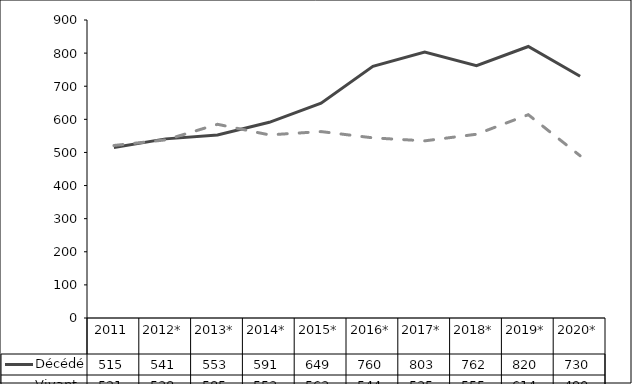
| Category | Décédé | Vivant |
|---|---|---|
| 2011 | 515 | 521 |
| 2012* | 541 | 538 |
| 2013* | 553 | 585 |
| 2014* | 591 | 553 |
| 2015* | 649 | 563 |
| 2016* | 760 | 544 |
| 2017* | 803 | 535 |
| 2018* | 762 | 555 |
| 2019* | 820 | 614 |
| 2020* | 730 | 490 |